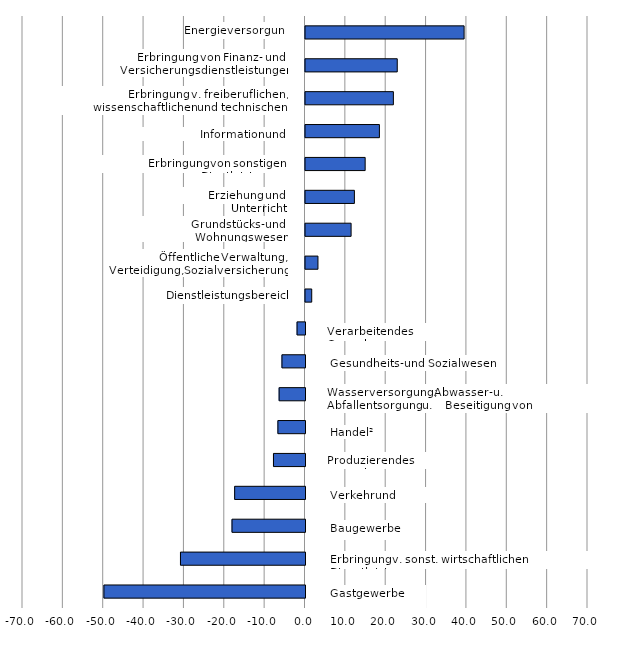
| Category | Series 0 |
|---|---|
| Gastgewerbe                                       | -49.825 |
| Erbringung v. sonstigen wirtschaftlichen Dienstleistungen | -30.854 |
| Verkehr und Lagerei              | -18.082 |
| Baugewerbe | -17.427 |
| Produzierendes Gewerbe | -7.813 |
| Wasserversorgung | -6.713 |
| Handel2                                            | -6.409 |
| Verarbeitendes Gewerbe                            | -5.708 |
| Gesundheits- u. Sozialwesen           | -1.965 |
| Dienstleistungsbereich | 1.544 |
| Öffentliche Verwaltung, Verteidigung, Sozialversicherung | 3.088 |
| Erziehung und Unterricht                          | 11.298 |
| Grundstücks- und Wohnungswesen             | 12.117 |
| Erbringung v. sonst. Dienstleistungen    | 14.784 |
| Erbringung v. freiberuflichen, wissenschaftl. u. technischen Dienstleistungen | 18.316 |
| Information und Kommunikation | 21.778 |
| Erbringung v. Finanz- u. Versicherungsleistungen                  | 22.737 |
| Energieversorgung                     | 39.298 |